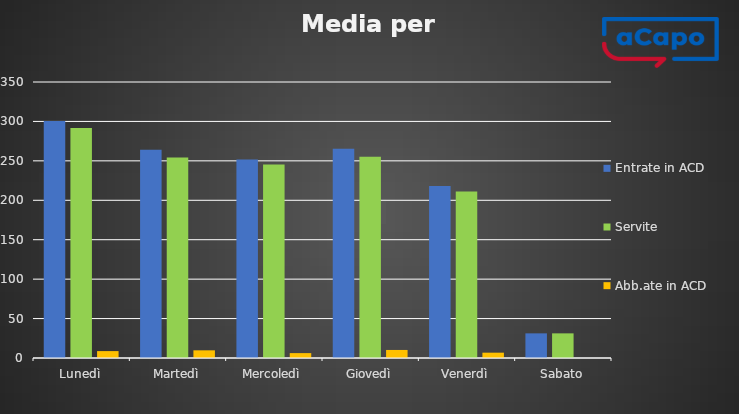
| Category | Entrate in ACD | Servite | Abb.ate in ACD |
|---|---|---|---|
| Lunedì | 300.5 | 291.75 | 8.75 |
| Martedì | 264 | 254.25 | 9.75 |
| Mercoledì | 251.6 | 245.4 | 6.2 |
| Giovedì | 265.4 | 255.2 | 10.2 |
| Venerdì | 218 | 211.25 | 6.75 |
| Sabato | 31.25 | 31.25 | 0 |